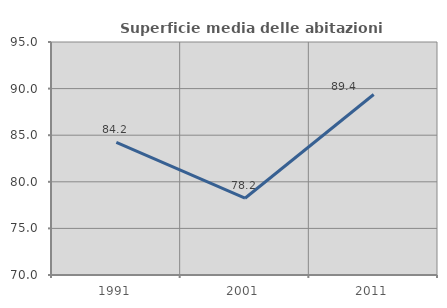
| Category | Superficie media delle abitazioni occupate |
|---|---|
| 1991.0 | 84.223 |
| 2001.0 | 78.238 |
| 2011.0 | 89.363 |